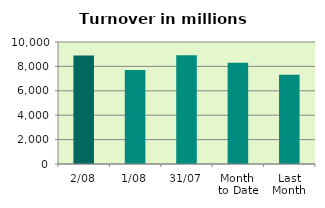
| Category | Series 0 |
|---|---|
| 2/08 | 8897.432 |
| 1/08 | 7701.882 |
| 31/07 | 8922.073 |
| Month 
to Date | 8299.657 |
| Last
Month | 7313.522 |